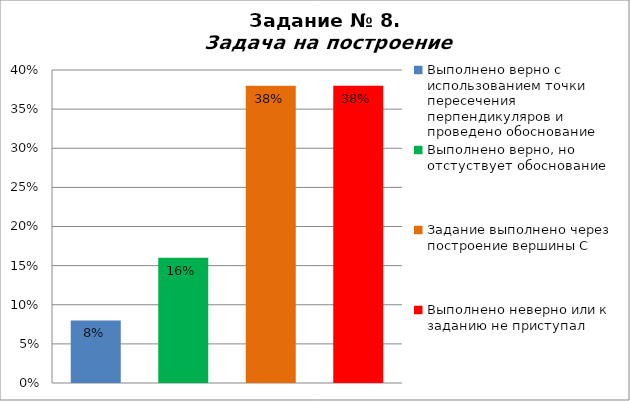
| Category | Задача на построение |
|---|---|
| Выполнено верно с использованием точки пересечения перпендикуляров и проведено обоснование | 0.08 |
| Выполнено верно, но отстуствует обоснование | 0.16 |
| Задание выполнено через построение вершины С | 0.38 |
| Выполнено неверно или к заданию не приступал | 0.38 |